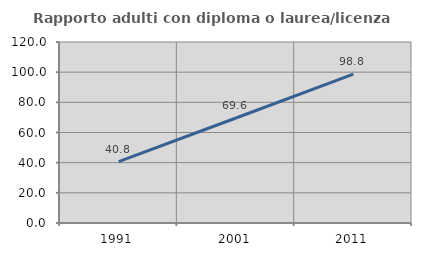
| Category | Rapporto adulti con diploma o laurea/licenza media  |
|---|---|
| 1991.0 | 40.752 |
| 2001.0 | 69.618 |
| 2011.0 | 98.756 |